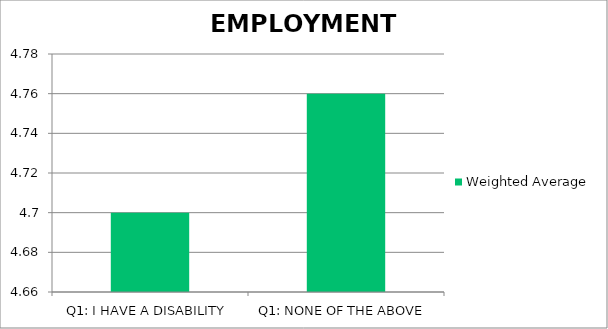
| Category | Weighted Average |
|---|---|
| Q1: I HAVE A DISABILITY | 4.7 |
| Q1: NONE OF THE ABOVE | 4.76 |